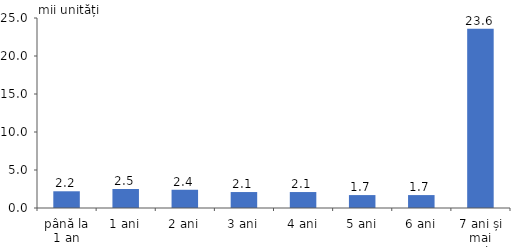
| Category | Series 0 |
|---|---|
| până la 1 an | 2.2 |
| 1 ani | 2.5 |
| 2 ani | 2.4 |
| 3 ani | 2.1 |
| 4 ani | 2.1 |
| 5 ani | 1.7 |
| 6 ani | 1.7 |
| 7 ani și mai mulți | 23.6 |